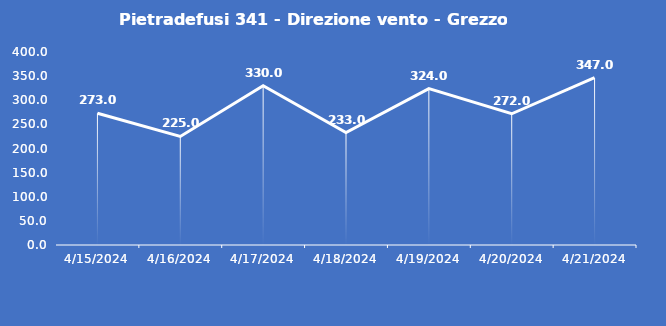
| Category | Pietradefusi 341 - Direzione vento - Grezzo (°N) |
|---|---|
| 4/15/24 | 273 |
| 4/16/24 | 225 |
| 4/17/24 | 330 |
| 4/18/24 | 233 |
| 4/19/24 | 324 |
| 4/20/24 | 272 |
| 4/21/24 | 347 |